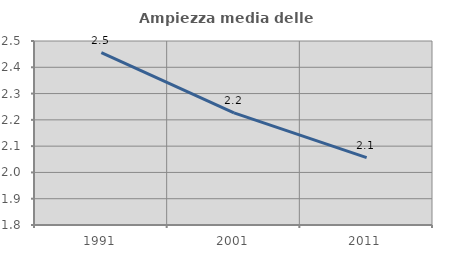
| Category | Ampiezza media delle famiglie |
|---|---|
| 1991.0 | 2.456 |
| 2001.0 | 2.226 |
| 2011.0 | 2.056 |